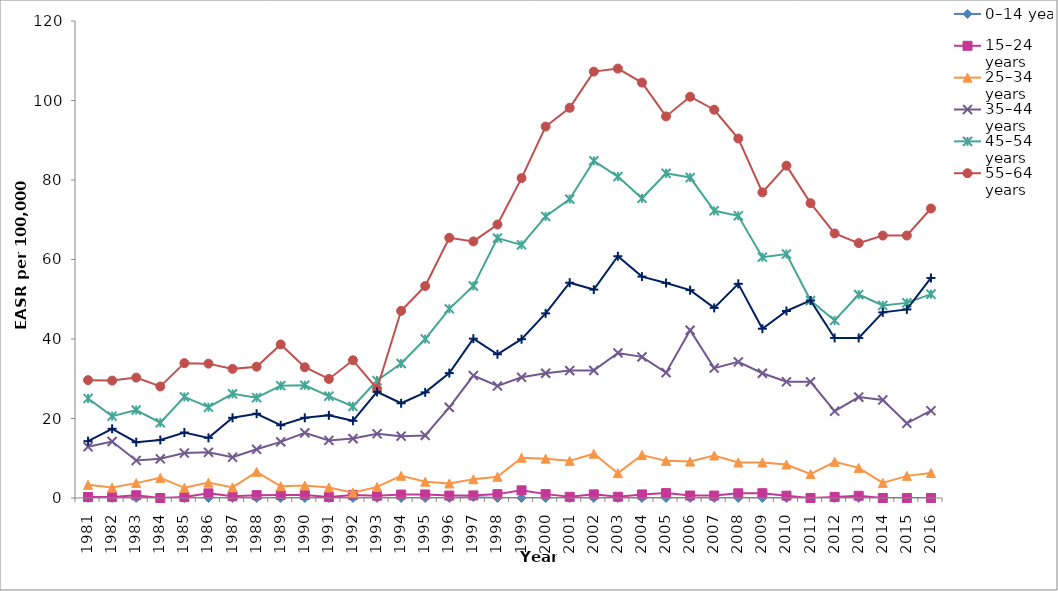
| Category | 0–14 years | 15–24 years | 25–34 years | 35–44 years | 45–54 years | 55–64 years | 65 + years |
|---|---|---|---|---|---|---|---|
| 1981.0 | 0 | 0.248 | 3.305 | 12.883 | 25.029 | 29.651 | 14.3 |
| 1982.0 | 0 | 0.243 | 2.617 | 14.204 | 20.584 | 29.535 | 17.406 |
| 1983.0 | 0 | 0.685 | 3.746 | 9.434 | 22.111 | 30.286 | 14.031 |
| 1984.0 | 0 | 0 | 5.062 | 9.854 | 18.929 | 28.06 | 14.583 |
| 1985.0 | 0 | 0.232 | 2.564 | 11.296 | 25.434 | 33.924 | 16.476 |
| 1986.0 | 0 | 1.168 | 3.863 | 11.498 | 22.838 | 33.801 | 15.129 |
| 1987.0 | 0 | 0.466 | 2.672 | 10.253 | 26.195 | 32.486 | 20.176 |
| 1988.0 | 0 | 0.72 | 6.587 | 12.248 | 25.249 | 33.035 | 21.199 |
| 1989.0 | 0 | 0.744 | 2.954 | 14.125 | 28.262 | 38.638 | 18.295 |
| 1990.0 | 0 | 0.754 | 3.123 | 16.385 | 28.362 | 32.899 | 20.168 |
| 1991.0 | 0 | 0.254 | 2.665 | 14.483 | 25.61 | 29.954 | 20.792 |
| 1992.0 | 0 | 0.785 | 1.346 | 14.946 | 23.03 | 34.651 | 19.428 |
| 1993.0 | 0 | 0.575 | 2.798 | 16.162 | 29.569 | 27.484 | 26.709 |
| 1994.0 | 0 | 0.868 | 5.59 | 15.546 | 33.826 | 47.092 | 23.83 |
| 1995.0 | 0 | 0.892 | 4.111 | 15.736 | 39.997 | 53.321 | 26.582 |
| 1996.0 | 0 | 0.616 | 3.654 | 22.792 | 47.596 | 65.459 | 31.423 |
| 1997.0 | 0.211 | 0.652 | 4.719 | 30.796 | 53.34 | 64.552 | 40.084 |
| 1998.0 | 0 | 0.977 | 5.34 | 28.18 | 65.38 | 68.794 | 36.166 |
| 1999.0 | 0 | 1.919 | 10.128 | 30.357 | 63.687 | 80.478 | 39.95 |
| 2000.0 | 0 | 0.975 | 9.897 | 31.392 | 70.841 | 93.443 | 46.449 |
| 2001.0 | 0 | 0.297 | 9.346 | 32.048 | 75.204 | 98.164 | 54.16 |
| 2002.0 | 0 | 0.914 | 11.139 | 32.097 | 84.821 | 107.267 | 52.431 |
| 2003.0 | 0 | 0.318 | 6.249 | 36.487 | 80.867 | 108.033 | 60.82 |
| 2004.0 | 0 | 0.902 | 10.811 | 35.502 | 75.4 | 104.508 | 55.7 |
| 2005.0 | 0 | 1.234 | 9.345 | 31.526 | 81.686 | 95.998 | 54.086 |
| 2006.0 | 0 | 0.623 | 9.16 | 42.207 | 80.619 | 100.945 | 52.29 |
| 2007.0 | 0 | 0.617 | 10.698 | 32.672 | 72.253 | 97.675 | 47.832 |
| 2008.0 | 0 | 1.181 | 8.935 | 34.239 | 70.998 | 90.429 | 53.877 |
| 2009.0 | 0 | 1.204 | 8.945 | 31.377 | 60.578 | 76.892 | 42.589 |
| 2010.0 | 0 | 0.593 | 8.428 | 29.236 | 61.387 | 83.608 | 47.045 |
| 2011.0 | 0 | 0 | 6.013 | 29.229 | 49.674 | 74.173 | 49.699 |
| 2012.0 | 0 | 0.282 | 9.102 | 21.837 | 44.673 | 66.557 | 40.259 |
| 2013.0 | 0 | 0.566 | 7.571 | 25.393 | 51.177 | 64.131 | 40.264 |
| 2014.0 | 0 | 0 | 3.796 | 24.676 | 48.438 | 66.026 | 46.699 |
| 2015.0 | 0 | 0 | 5.569 | 18.787 | 49.089 | 66.035 | 47.447 |
| 2016.0 | 0 | 0 | 6.288 | 21.958 | 51.286 | 72.829 | 55.354 |